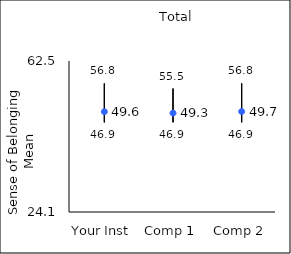
| Category | 25th percentile | 75th percentile | Mean |
|---|---|---|---|
| Your Inst | 46.9 | 56.8 | 49.61 |
| Comp 1 | 46.9 | 55.5 | 49.27 |
| Comp 2 | 46.9 | 56.8 | 49.65 |